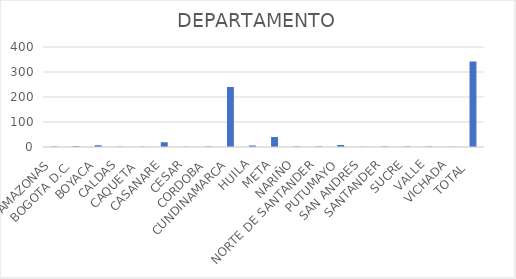
| Category | Series 0 |
|---|---|
| AMAZONAS | 2 |
| BOGOTA D.C. | 3 |
| BOYACA | 7 |
| CALDAS | 1 |
| CAQUETA  | 1 |
| CASANARE | 19 |
| CESAR | 1 |
| CORDOBA | 2 |
| CUNDINAMARCA | 240 |
| HUILA | 6 |
| META | 40 |
| NARIÑO | 2 |
| NORTE DE SANTANDER | 2 |
| PUTUMAYO | 8 |
| SAN ANDRES | 1 |
| SANTANDER | 2 |
| SUCRE | 2 |
| VALLE | 2 |
| VICHADA | 1 |
| TOTAL  | 342 |